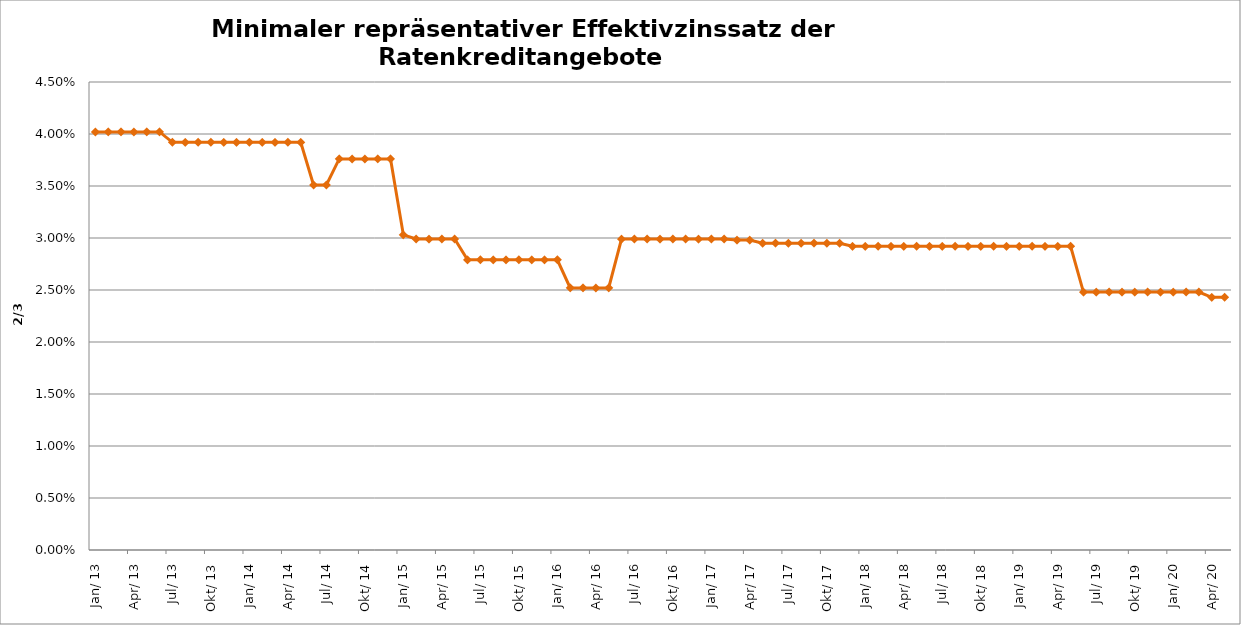
| Category | Series 0 |
|---|---|
| 2013-01-01 | 0.04 |
| 2013-02-01 | 0.04 |
| 2013-03-01 | 0.04 |
| 2013-04-01 | 0.04 |
| 2013-05-01 | 0.04 |
| 2013-06-01 | 0.04 |
| 2013-07-01 | 0.039 |
| 2013-08-01 | 0.039 |
| 2013-09-01 | 0.039 |
| 2013-10-01 | 0.039 |
| 2013-11-01 | 0.039 |
| 2013-12-01 | 0.039 |
| 2014-01-01 | 0.039 |
| 2014-02-01 | 0.039 |
| 2014-03-01 | 0.039 |
| 2014-04-01 | 0.039 |
| 2014-05-01 | 0.039 |
| 2014-06-01 | 0.035 |
| 2014-07-01 | 0.035 |
| 2014-08-01 | 0.038 |
| 2014-09-01 | 0.038 |
| 2014-10-01 | 0.038 |
| 2014-11-01 | 0.038 |
| 2014-12-01 | 0.038 |
| 2015-01-01 | 0.03 |
| 2015-02-01 | 0.03 |
| 2015-03-01 | 0.03 |
| 2015-04-01 | 0.03 |
| 2015-05-01 | 0.03 |
| 2015-06-01 | 0.028 |
| 2015-07-01 | 0.028 |
| 2015-08-01 | 0.028 |
| 2015-09-01 | 0.028 |
| 2015-10-01 | 0.028 |
| 2015-11-01 | 0.028 |
| 2015-12-01 | 0.028 |
| 2016-01-01 | 0.028 |
| 2016-02-01 | 0.025 |
| 2016-03-01 | 0.025 |
| 2016-04-01 | 0.025 |
| 2016-05-01 | 0.025 |
| 2016-06-01 | 0.03 |
| 2016-07-01 | 0.03 |
| 2016-08-01 | 0.03 |
| 2016-09-01 | 0.03 |
| 2016-10-01 | 0.03 |
| 2016-11-01 | 0.03 |
| 2016-12-01 | 0.03 |
| 2017-01-01 | 0.03 |
| 2017-02-01 | 0.03 |
| 2017-03-01 | 0.03 |
| 2017-04-01 | 0.03 |
| 2017-05-01 | 0.03 |
| 2017-06-01 | 0.03 |
| 2017-07-01 | 0.03 |
| 2017-08-01 | 0.03 |
| 2017-09-01 | 0.03 |
| 2017-10-01 | 0.03 |
| 2017-11-01 | 0.03 |
| 2017-12-01 | 0.029 |
| 2018-01-01 | 0.029 |
| 2018-02-01 | 0.029 |
| 2018-03-01 | 0.029 |
| 2018-04-01 | 0.029 |
| 2018-05-01 | 0.029 |
| 2018-06-01 | 0.029 |
| 2018-07-01 | 0.029 |
| 2018-08-01 | 0.029 |
| 2018-09-01 | 0.029 |
| 2018-10-01 | 0.029 |
| 2018-11-01 | 0.029 |
| 2018-12-01 | 0.029 |
| 2019-01-01 | 0.029 |
| 2019-02-01 | 0.029 |
| 2019-03-01 | 0.029 |
| 2019-04-01 | 0.029 |
| 2019-05-01 | 0.029 |
| 2019-06-01 | 0.025 |
| 2019-07-01 | 0.025 |
| 2019-08-01 | 0.025 |
| 2019-09-01 | 0.025 |
| 2019-10-01 | 0.025 |
| 2019-11-01 | 0.025 |
| 2019-12-01 | 0.025 |
| 2020-01-01 | 0.025 |
| 2020-02-01 | 0.025 |
| 2020-03-01 | 0.025 |
| 2020-04-01 | 0.024 |
| 2020-05-01 | 0.024 |